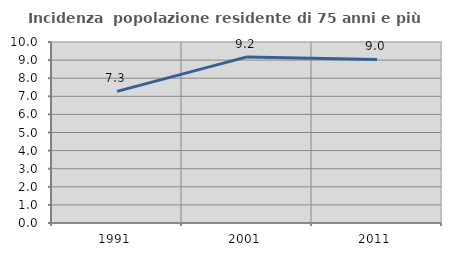
| Category | Incidenza  popolazione residente di 75 anni e più |
|---|---|
| 1991.0 | 7.271 |
| 2001.0 | 9.177 |
| 2011.0 | 9.034 |